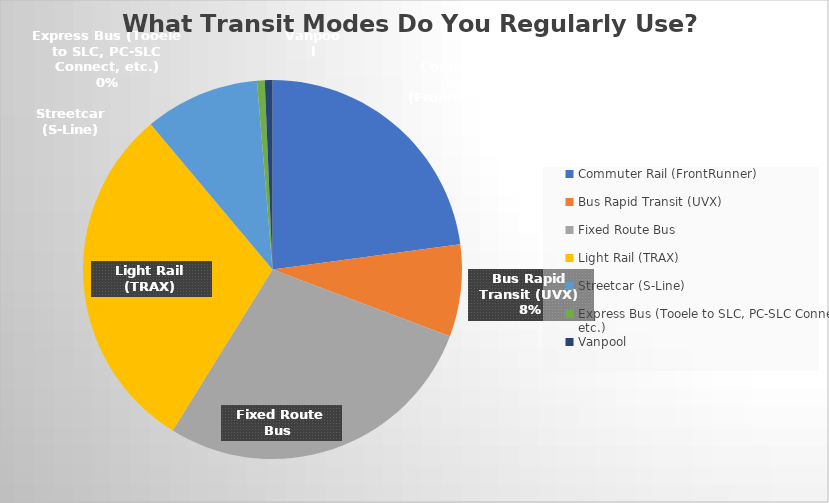
| Category | Series 0 |
|---|---|
| Commuter Rail (FrontRunner) | 35 |
| Bus Rapid Transit (UVX) | 12 |
| Fixed Route Bus  | 43 |
| Light Rail (TRAX) | 46 |
| Streetcar (S-Line) | 15 |
| Express Bus (Tooele to SLC, PC-SLC Connect, etc.) | 1 |
| Vanpool | 1 |